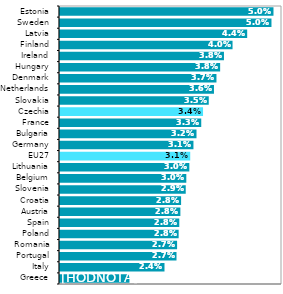
| Category | Series 0 |
|---|---|
| Greece | 0.016 |
| Italy | 0.024 |
| Portugal | 0.027 |
| Romania | 0.027 |
| Poland | 0.028 |
| Spain | 0.028 |
| Austria | 0.028 |
| Croatia | 0.028 |
| Slovenia | 0.029 |
| Belgium | 0.03 |
| Lithuania | 0.03 |
| EU27 | 0.031 |
| Germany | 0.031 |
| Bulgaria | 0.032 |
| France | 0.033 |
| Czechia | 0.034 |
| Slovakia | 0.035 |
| Netherlands | 0.036 |
| Denmark | 0.037 |
| Hungary | 0.038 |
| Ireland | 0.038 |
| Finland | 0.04 |
| Latvia | 0.044 |
| Sweden | 0.05 |
| Estonia | 0.05 |